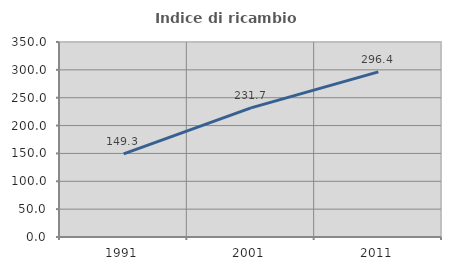
| Category | Indice di ricambio occupazionale  |
|---|---|
| 1991.0 | 149.315 |
| 2001.0 | 231.746 |
| 2011.0 | 296.364 |